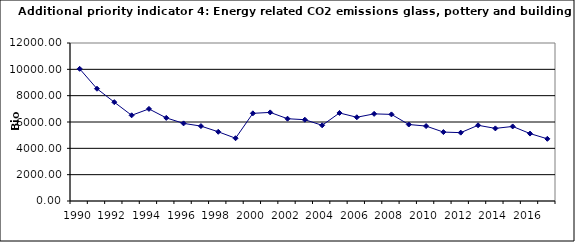
| Category | Energy related CO2 emissions glass, pottery and building materials, kt |
|---|---|
| 1990 | 10038.446 |
| 1991 | 8526.893 |
| 1992 | 7505.479 |
| 1993 | 6508.81 |
| 1994 | 6994.038 |
| 1995 | 6312.66 |
| 1996 | 5894.729 |
| 1997 | 5689.333 |
| 1998 | 5257.576 |
| 1999 | 4767.593 |
| 2000 | 6657.469 |
| 2001 | 6729.653 |
| 2002 | 6248.575 |
| 2003 | 6173.785 |
| 2004 | 5748.453 |
| 2005 | 6686.896 |
| 2006 | 6359.855 |
| 2007 | 6617.185 |
| 2008 | 6576.881 |
| 2009 | 5808.965 |
| 2010 | 5690.39 |
| 2011 | 5233.968 |
| 2012 | 5190.713 |
| 2013 | 5750.061 |
| 2014 | 5514.864 |
| 2015 | 5662.004 |
| 2016 | 5121.409 |
| 2017 | 4722.13 |